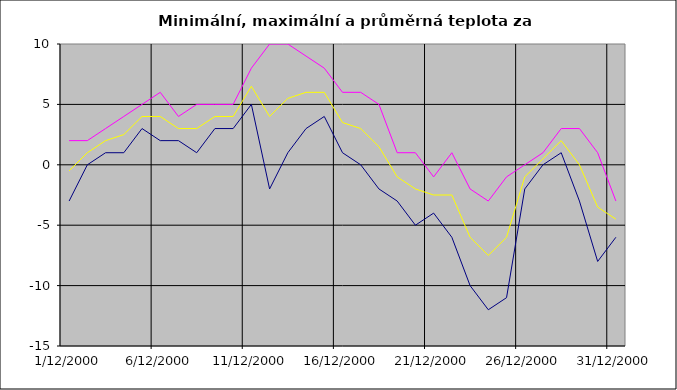
| Category | Series 0 | Series 1 | Series 2 |
|---|---|---|---|
| 2000-12-01 | -3 | 2 | -0.5 |
| 2000-12-02 | 0 | 2 | 1 |
| 2000-12-03 | 1 | 3 | 2 |
| 2000-12-04 | 1 | 4 | 2.5 |
| 2000-12-05 | 3 | 5 | 4 |
| 2000-12-06 | 2 | 6 | 4 |
| 2000-12-07 | 2 | 4 | 3 |
| 2000-12-08 | 1 | 5 | 3 |
| 2000-12-09 | 3 | 5 | 4 |
| 2000-12-10 | 3 | 5 | 4 |
| 2000-12-11 | 5 | 8 | 6.5 |
| 2000-12-12 | -2 | 10 | 4 |
| 2000-12-13 | 1 | 10 | 5.5 |
| 2000-12-14 | 3 | 9 | 6 |
| 2000-12-15 | 4 | 8 | 6 |
| 2000-12-16 | 1 | 6 | 3.5 |
| 2000-12-17 | 0 | 6 | 3 |
| 2000-12-18 | -2 | 5 | 1.5 |
| 2000-12-19 | -3 | 1 | -1 |
| 2000-12-20 | -5 | 1 | -2 |
| 2000-12-21 | -4 | -1 | -2.5 |
| 2000-12-22 | -6 | 1 | -2.5 |
| 2000-12-23 | -10 | -2 | -6 |
| 2000-12-24 | -12 | -3 | -7.5 |
| 2000-12-25 | -11 | -1 | -6 |
| 2000-12-26 | -2 | 0 | -1 |
| 2000-12-27 | 0 | 1 | 0.5 |
| 2000-12-28 | 1 | 3 | 2 |
| 2000-12-29 | -3 | 3 | 0 |
| 2000-12-30 | -8 | 1 | -3.5 |
| 2000-12-31 | -6 | -3 | -4.5 |